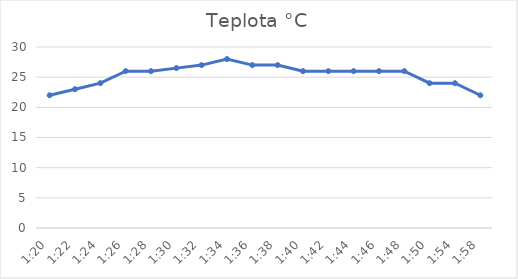
| Category | Teplota °C |
|---|---|
| 0.05555555555555555 | 22 |
| 0.05694444444444444 | 23 |
| 0.0583333333333333 | 24 |
| 0.0597222222222222 | 26 |
| 0.0611111111111111 | 26 |
| 0.0625 | 26.5 |
| 0.0638888888888889 | 27 |
| 0.0652777777777778 | 28 |
| 0.0666666666666667 | 27 |
| 0.0680555555555555 | 27 |
| 0.0694444444444444 | 26 |
| 0.0708333333333334 | 26 |
| 0.0722222222222223 | 26 |
| 0.0736111111111112 | 26 |
| 0.0750000000000001 | 26 |
| 0.076388888888889 | 24 |
| 0.07916666666666666 | 24 |
| 0.08194444444444444 | 22 |